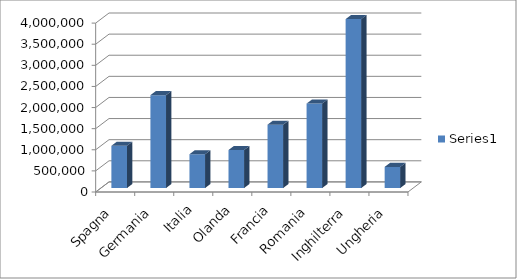
| Category | Series 0 |
|---|---|
| Spagna | 1000000 |
| Germania | 2200000 |
| Italia | 800000 |
| Olanda | 900000 |
| Francia | 1500000 |
| Romania | 2000000 |
| Inghilterra | 4000000 |
| Ungheria | 500000 |